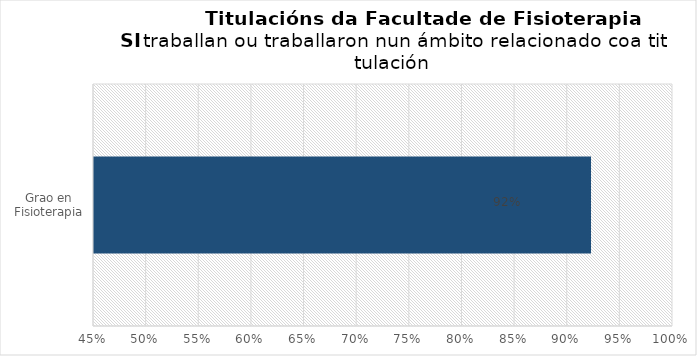
| Category | Series 0 |
|---|---|
| Grao en Fisioterapia | 0.923 |